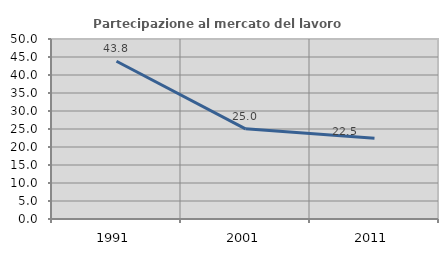
| Category | Partecipazione al mercato del lavoro  femminile |
|---|---|
| 1991.0 | 43.81 |
| 2001.0 | 25.049 |
| 2011.0 | 22.462 |